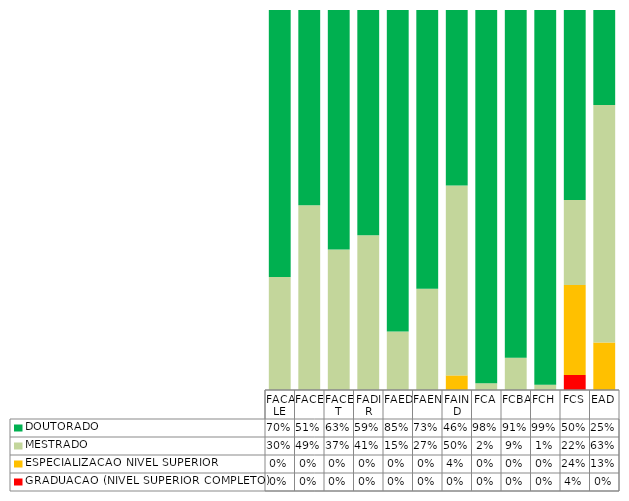
| Category | GRADUACAO (NIVEL SUPERIOR COMPLETO)   | ESPECIALIZACAO NIVEL SUPERIOR         | MESTRADO                              | DOUTORADO                             |
|---|---|---|---|---|
| FACALE | 0 | 0 | 0.297 | 0.703 |
| FACE | 0 | 0 | 0.486 | 0.514 |
| FACET | 0 | 0 | 0.37 | 0.63 |
| FADIR | 0 | 0 | 0.407 | 0.593 |
| FAED | 0 | 0 | 0.154 | 0.846 |
| FAEN | 0 | 0 | 0.267 | 0.733 |
| FAIND | 0 | 0.038 | 0.5 | 0.462 |
| FCA | 0 | 0 | 0.018 | 0.982 |
| FCBA | 0 | 0 | 0.085 | 0.915 |
| FCH | 0 | 0 | 0.014 | 0.986 |
| FCS | 0.039 | 0.237 | 0.224 | 0.5 |
| EAD | 0 | 0.125 | 0.625 | 0.25 |